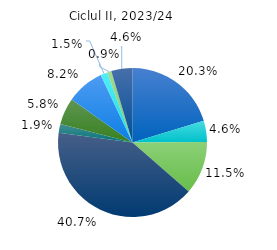
| Category | 2023/24 |
|---|---|
| 0 | 20.3 |
| 1 | 4.6 |
| 2 | 11.5 |
| 3 | 40.7 |
| 4 | 1.9 |
| 5 | 5.8 |
| 6 | 8.2 |
| 7 | 1.5 |
| 8 | 0.9 |
| 9 | 4.6 |